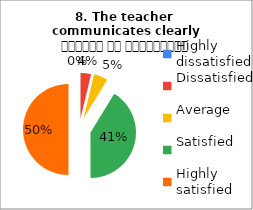
| Category | 8. The teacher 
communicates clearly शिक्षक का सम्प्रेषण सुस्पष्ट है |
|---|---|
| Highly dissatisfied | 0 |
| Dissatisfied | 3 |
| Average | 4 |
| Satisfied | 33 |
| Highly satisfied | 40 |